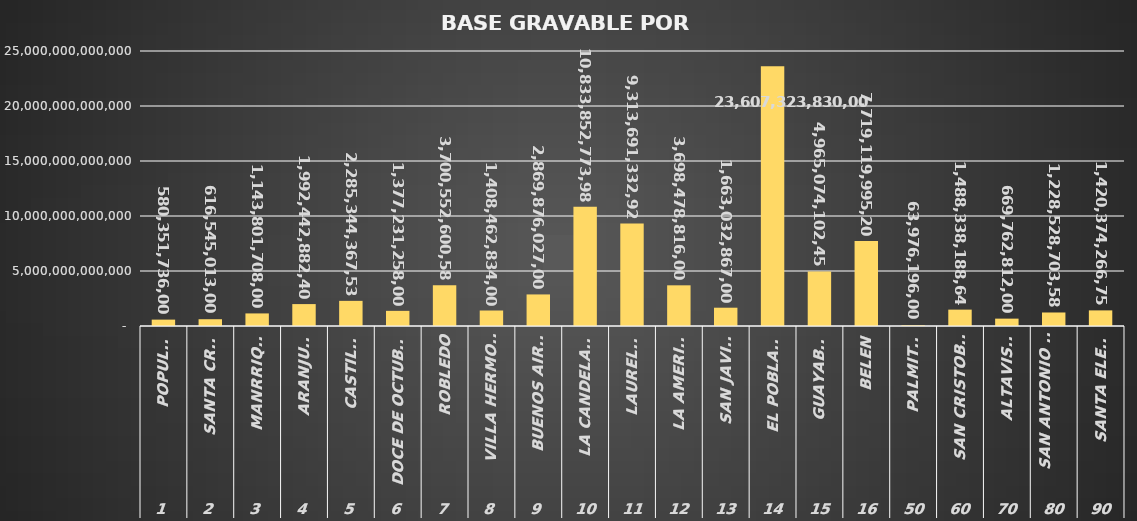
| Category | SumaDeAvaluoTotal |
|---|---|
| 0 | 580351736000 |
| 1 | 616545013000 |
| 2 | 1143801708000 |
| 3 | 1992442882401 |
| 4 | 2285344367530 |
| 5 | 1377231258000 |
| 6 | 3700552600580 |
| 7 | 1408462834000 |
| 8 | 2869876027000 |
| 9 | 10833852773981 |
| 10 | 9313691332920 |
| 11 | 3698478816000 |
| 12 | 1663032867000 |
| 13 | 23607323830000 |
| 14 | 4965074102450 |
| 15 | 7719119995200 |
| 16 | 63976196000 |
| 17 | 1488338188640 |
| 18 | 669762812000 |
| 19 | 1228528703587 |
| 20 | 1420374266759 |